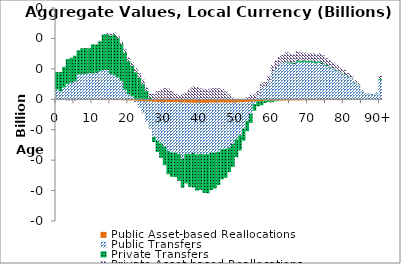
| Category | Public Asset-based Reallocations | Public Transfers | Private Transfers | Private Asset-based Reallocations |
|---|---|---|---|---|
| 0 | -0.949 | 32.376 | 57.008 | -0.45 |
|  | -0.954 | 26.289 | 62.996 | -0.808 |
| 2 | -0.982 | 39.069 | 67.493 | -0.943 |
| 3 | -1.036 | 50.064 | 82.213 | -2.847 |
| 4 | -1.077 | 54.528 | 81.724 | -2.451 |
| 5 | -1.102 | 58.521 | 84.604 | -2.588 |
| 6 | -1.157 | 81.744 | 79.285 | -1.187 |
| 7 | -1.265 | 82.971 | 84.456 | -0.859 |
| 8 | -1.332 | 83.377 | 84.912 | -0.488 |
| 9 | -1.418 | 85.316 | 82.734 | 1.053 |
| 10 | -1.529 | 85.078 | 95.523 | -0.489 |
| 11 | -1.636 | 86.744 | 93.738 | 1.549 |
| 12 | -1.725 | 92.725 | 97.941 | 2.025 |
| 13 | -1.975 | 96.266 | 116.741 | 1.79 |
| 14 | -2.076 | 96.201 | 118.55 | 4.013 |
| 15 | -2.293 | 83.095 | 126.408 | 6.331 |
| 16 | -2.624 | 78.222 | 134.234 | 6.22 |
| 17 | -2.742 | 71.096 | 129.946 | 7.917 |
| 18 | -2.834 | 60.389 | 121.065 | 8.214 |
| 19 | -3.237 | 31.218 | 122.347 | 10.519 |
| 20 | -3.532 | 16.48 | 109.146 | 11.463 |
| 21 | -3.927 | 9.769 | 100.436 | 11.005 |
| 22 | -4.832 | -4.419 | 88.914 | 14.265 |
| 23 | -5.514 | -21.946 | 71.332 | 14.693 |
| 24 | -6.15 | -40.149 | 49.771 | 14.63 |
| 25 | -6.928 | -67.577 | 27.456 | 11.6 |
| 26 | -7.488 | -89.038 | 4.606 | 13.01 |
| 27 | -8.205 | -115.295 | -16.951 | 17.93 |
| 28 | -8.854 | -127.52 | -36.59 | 26.936 |
| 29 | -9.045 | -135.399 | -48.2 | 32.397 |
| 30 | -9.391 | -145.42 | -61.763 | 36.822 |
| 31 | -9.962 | -159.607 | -76.387 | 34.869 |
| 32 | -10.27 | -164.808 | -79.769 | 27.321 |
| 33 | -10.043 | -165.041 | -80.517 | 17.661 |
| 34 | -10.397 | -169.021 | -88.668 | 14.236 |
| 35 | -10.533 | -185.404 | -94.896 | 16.825 |
| 36 | -11.049 | -168.152 | -97.084 | 22.815 |
| 37 | -11.597 | -168.007 | -108.07 | 34.317 |
| 38 | -11.798 | -164.741 | -113.298 | 42.643 |
| 39 | -11.842 | -169.171 | -119.14 | 39.891 |
| 40 | -11.732 | -167.338 | -118.934 | 35.791 |
| 41 | -11.905 | -168.799 | -126.886 | 34.514 |
| 42 | -11.83 | -168.152 | -129.101 | 33.536 |
| 43 | -11.286 | -164.372 | -122.668 | 35.637 |
| 44 | -11.005 | -164.515 | -117.734 | 36.772 |
| 45 | -10.821 | -161.977 | -109.157 | 36.542 |
| 46 | -10.629 | -153.08 | -99.189 | 33.746 |
| 47 | -11.12 | -151.717 | -94.767 | 26.392 |
| 48 | -11.027 | -147.346 | -81.137 | 15.993 |
| 49 | -11.066 | -135.872 | -75.127 | 5.056 |
| 50 | -10.506 | -120.997 | -58.289 | -0.55 |
| 51 | -10.421 | -108.029 | -49.749 | -1.533 |
| 52 | -9.509 | -86.659 | -40.012 | 0.498 |
| 53 | -9.239 | -61.668 | -34.094 | 6.637 |
| 54 | -8.352 | -39.843 | -29.648 | 14.7 |
| 55 | -7.156 | -8.584 | -21.915 | 16.057 |
| 56 | -6.511 | 11.306 | -16.518 | 16.318 |
| 57 | -6.143 | 36.637 | -13.433 | 17.611 |
| 58 | -4.227 | 42.472 | -7.765 | 14.551 |
| 59 | -3.987 | 59.708 | -4.902 | 15.668 |
| 60 | -4.773 | 91.712 | -4.699 | 20.984 |
| 61 | -4.501 | 103.202 | -1.908 | 23.938 |
| 62 | -4.277 | 114.654 | -0.809 | 27.555 |
| 63 | -4.031 | 116.481 | 1.428 | 28.711 |
| 64 | -4.022 | 121.657 | 2.939 | 29.782 |
| 65 | -3.778 | 117.79 | 3.981 | 28.41 |
| 66 | -3.535 | 115.413 | 4.61 | 27.43 |
| 67 | -3.59 | 123.516 | 5.164 | 28.631 |
| 68 | -3.376 | 121.337 | 5.495 | 26.819 |
| 69 | -3.253 | 122.959 | 5.118 | 25.378 |
| 70 | -3.115 | 120.904 | 4.726 | 24.675 |
| 71 | -3.069 | 122.522 | 4.662 | 25.261 |
| 72 | -2.974 | 118.028 | 5.005 | 25.403 |
| 73 | -3.027 | 119.832 | 5.191 | 26.89 |
| 74 | -2.81 | 115.3 | 4.744 | 25.098 |
| 75 | -2.635 | 108.807 | 4.138 | 22.433 |
| 76 | -2.506 | 103.763 | 3.614 | 20.972 |
| 77 | -2.315 | 98.302 | 2.971 | 19.71 |
| 78 | -2.116 | 92.511 | 2.307 | 17.735 |
| 79 | -1.909 | 85.862 | 1.952 | 15.509 |
| 80 | -1.774 | 81.47 | 1.812 | 13.506 |
| 81 | -1.565 | 73.957 | 1.655 | 10.831 |
| 82 | -1.378 | 69.263 | 1.607 | 8.477 |
| 83 | -1.079 | 54.697 | 1.449 | 6.782 |
| 84 | -0.913 | 46.547 | 1.355 | 5.956 |
| 85 | -0.51 | 26.597 | 0.836 | 3.606 |
| 86 | -0.337 | 17.712 | 0.609 | 2.498 |
| 87 | -0.317 | 16.929 | 0.633 | 2.449 |
| 88 | -0.257 | 13.934 | 0.637 | 1.998 |
| 89 | -0.355 | 19.415 | 0.983 | 2.902 |
| 90+ | -1.131 | 62.928 | 3.506 | 10.073 |